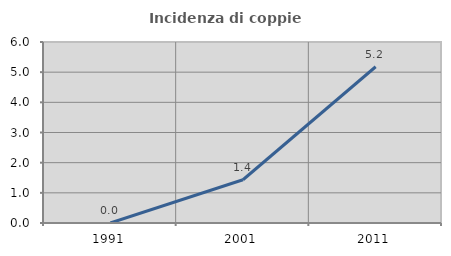
| Category | Incidenza di coppie miste |
|---|---|
| 1991.0 | 0 |
| 2001.0 | 1.434 |
| 2011.0 | 5.179 |